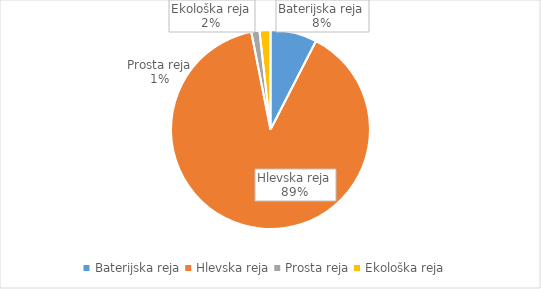
| Category | Količina kosov jajc |
|---|---|
| Baterijska reja | 236219 |
| Hlevska reja | 2791584 |
| Prosta reja | 41463 |
| Ekološka reja | 55377 |